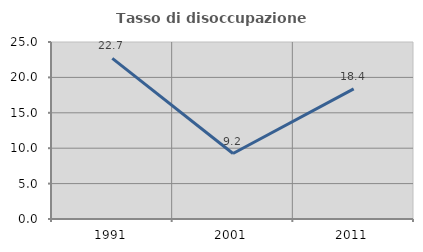
| Category | Tasso di disoccupazione giovanile  |
|---|---|
| 1991.0 | 22.695 |
| 2001.0 | 9.247 |
| 2011.0 | 18.388 |